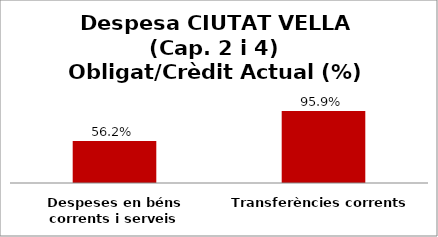
| Category | Series 0 |
|---|---|
| Despeses en béns corrents i serveis | 0.562 |
| Transferències corrents | 0.959 |